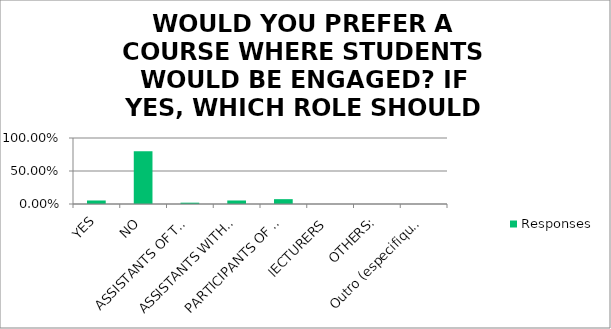
| Category | Responses |
|---|---|
| YES | 0.053 |
| NO | 0.8 |
| ASSISTANTS OF THE LECTURER | 0.02 |
| ASSISTANTS WITH INFORMATION TECHNOLOGIES | 0.053 |
| PARTICIPANTS OF INTERGENERATION DIALOGUE | 0.073 |
| lECTURERS | 0 |
| OTHERS: | 0 |
| Outro (especifique) | 0 |